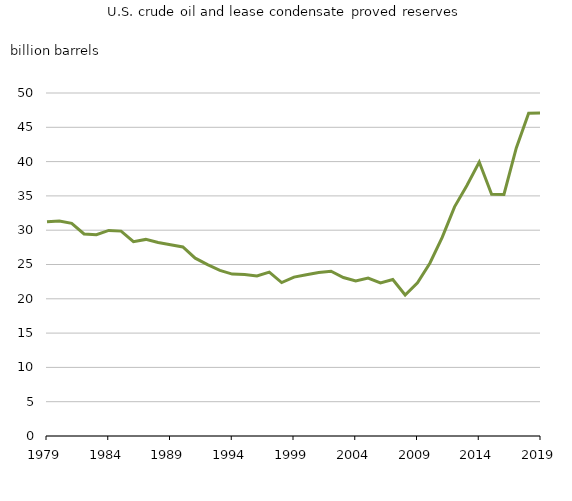
| Category | U.S. crude oil and lease condensate proved reserves (billion barrels) |
|---|---|
| 1979.0 | 31.221 |
| 1980.0 | 31.335 |
| 1981.0 | 31.006 |
| 1982.0 | 29.459 |
| 1983.0 | 29.348 |
| 1984.0 | 29.968 |
| 1985.0 | 29.869 |
| 1986.0 | 28.325 |
| 1987.0 | 28.658 |
| 1988.0 | 28.214 |
| 1989.0 | 27.89 |
| 1990.0 | 27.556 |
| 1991.0 | 25.926 |
| 1992.0 | 24.971 |
| 1993.0 | 24.149 |
| 1994.0 | 23.604 |
| 1995.0 | 23.548 |
| 1996.0 | 23.324 |
| 1997.0 | 23.887 |
| 1998.0 | 22.37 |
| 1999.0 | 23.168 |
| 2000.0 | 23.517 |
| 2001.0 | 23.844 |
| 2002.0 | 24.023 |
| 2003.0 | 23.106 |
| 2004.0 | 22.592 |
| 2005.0 | 23.019 |
| 2006.0 | 22.311 |
| 2007.0 | 22.812 |
| 2008.0 | 20.554 |
| 2009.0 | 22.315 |
| 2010.0 | 25.181 |
| 2011.0 | 28.95 |
| 2012.0 | 33.403 |
| 2013.0 | 36.52 |
| 2014.0 | 39.933 |
| 2015.0 | 35.23 |
| 2016.0 | 35.213 |
| 2017.0 | 41.99 |
| 2018.0 | 47.053 |
| 2019.0 | 47.107 |